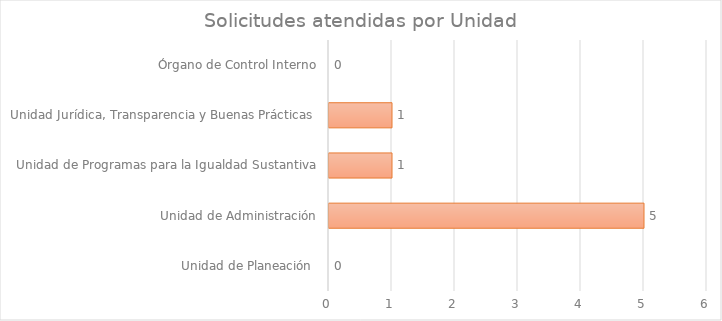
| Category | Series 1 |
|---|---|
| Unidad de Planeación  | 0 |
| Unidad de Administración | 5 |
| Unidad de Programas para la Igualdad Sustantiva | 1 |
| Unidad Jurídica, Transparencia y Buenas Prácticas  | 1 |
| Órgano de Control Interno | 0 |